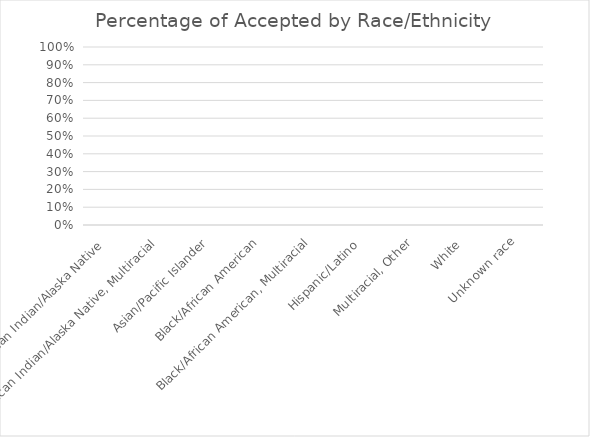
| Category | % of accepted |
|---|---|
| American Indian/Alaska Native  | 0 |
| American Indian/Alaska Native, Multiracial | 0 |
| Asian/Pacific Islander | 0 |
| Black/African American | 0 |
| Black/African American, Multiracial | 0 |
| Hispanic/Latino  | 0 |
| Multiracial, Other | 0 |
| White  | 0 |
| Unknown race | 0 |